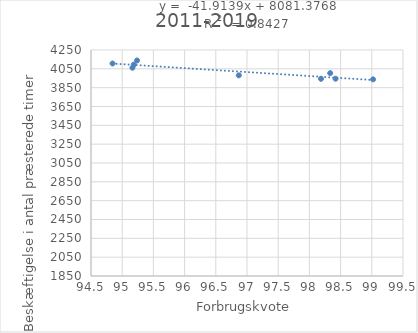
| Category | Series 0 |
|---|---|
| 98.33333333333333 | 4004.3 |
| 99.02067464635473 | 3938.1 |
| 98.18569903948773 | 3943.9 |
| 98.41938883034773 | 3945.2 |
| 96.86868686868686 | 3980.8 |
| 95.16441005802709 | 4061.7 |
| 94.84536082474226 | 4106.5 |
| 95.18619436875568 | 4095.1 |
| 95.23809523809523 | 4138.8 |